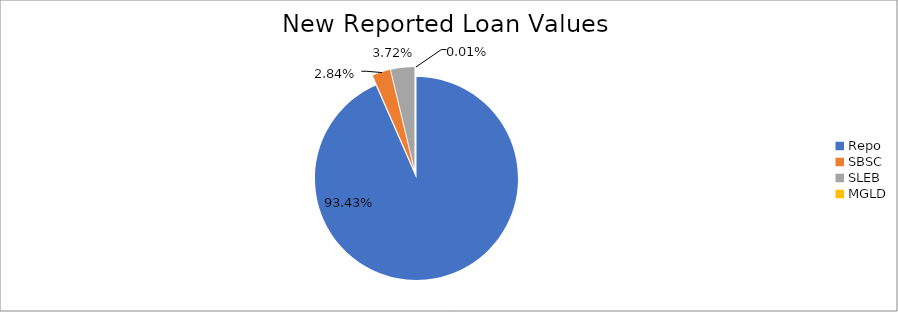
| Category | Series 0 |
|---|---|
| Repo | 9289021.093 |
| SBSC | 282516.546 |
| SLEB | 370181.02 |
| MGLD | 867.187 |